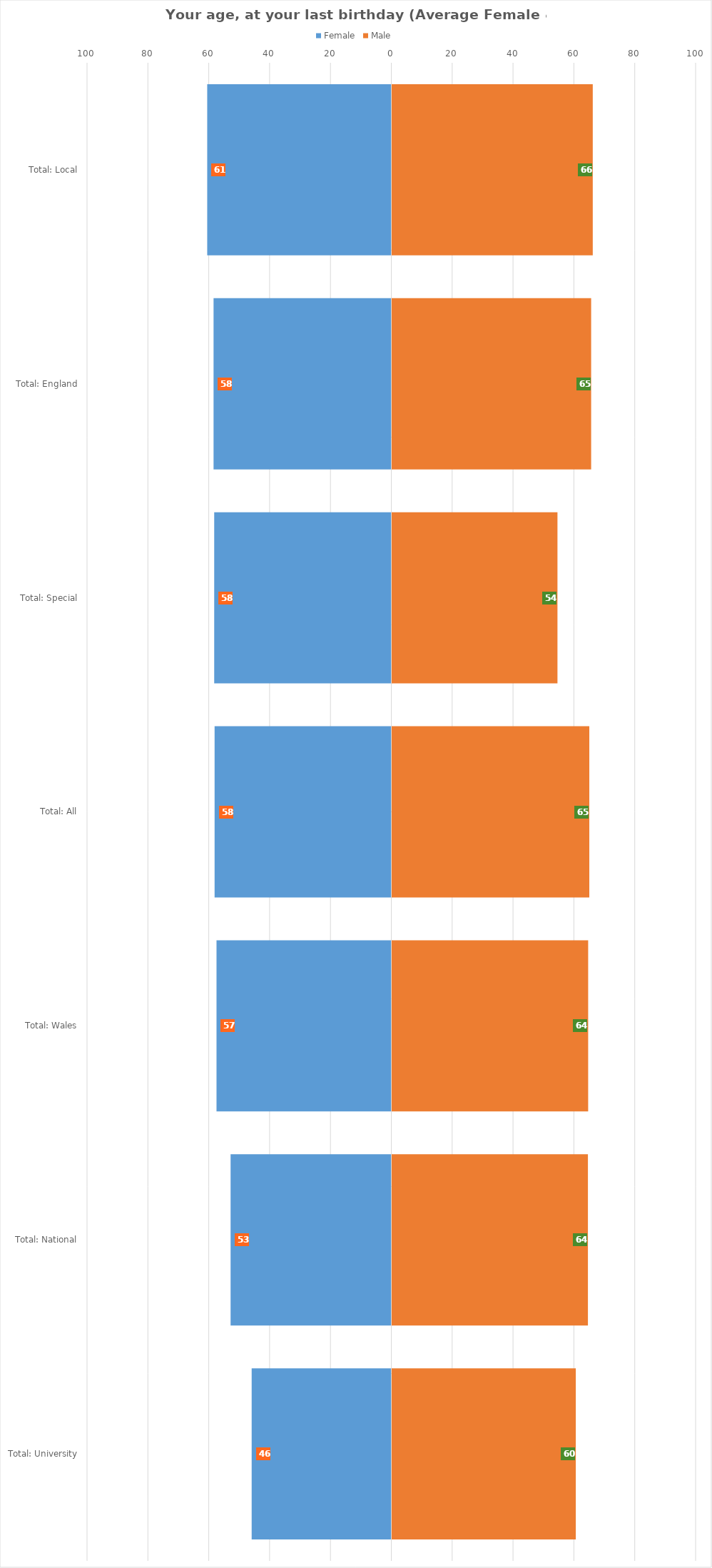
| Category | Female | Male |
|---|---|---|
| Total: Local | -60.506 | 65.972 |
| Total: England | -58.42 | 65.44 |
| Total: Special | -58.208 | 54.37 |
| Total: All | -58.08 | 64.836 |
| Total: Wales | -57.45 | 64.459 |
| Total: National | -52.819 | 64.38 |
| Total: University | -45.897 | 60.397 |